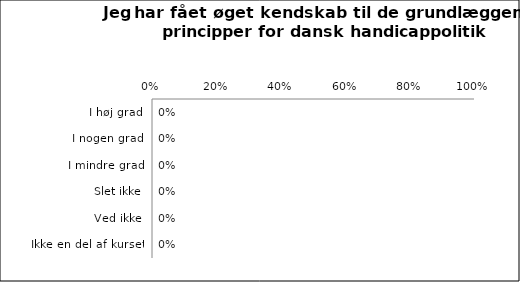
| Category | Øget kendskab tilgrundlæggende principper for dansk politik |
|---|---|
| I høj grad | 0 |
| I nogen grad | 0 |
| I mindre grad | 0 |
| Slet ikke | 0 |
| Ved ikke | 0 |
| Ikke en del af kurset | 0 |